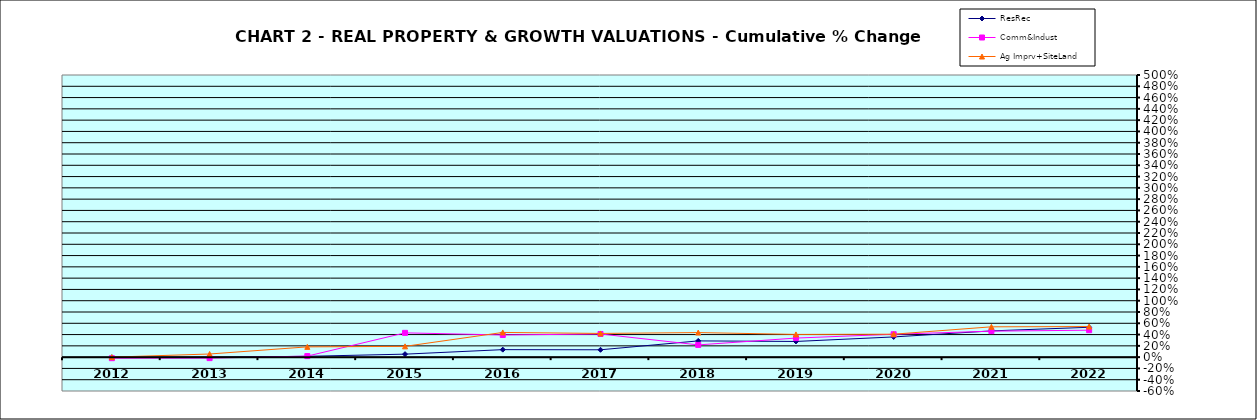
| Category | ResRec | Comm&Indust | Ag Imprv+SiteLand |
|---|---|---|---|
| 2012.0 | -0.003 | -0.018 | 0 |
| 2013.0 | -0.001 | -0.017 | 0.055 |
| 2014.0 | 0.015 | 0.018 | 0.182 |
| 2015.0 | 0.053 | 0.43 | 0.191 |
| 2016.0 | 0.133 | 0.393 | 0.438 |
| 2017.0 | 0.13 | 0.41 | 0.42 |
| 2018.0 | 0.288 | 0.217 | 0.435 |
| 2019.0 | 0.278 | 0.338 | 0.403 |
| 2020.0 | 0.358 | 0.406 | 0.407 |
| 2021.0 | 0.465 | 0.46 | 0.537 |
| 2022.0 | 0.529 | 0.477 | 0.542 |